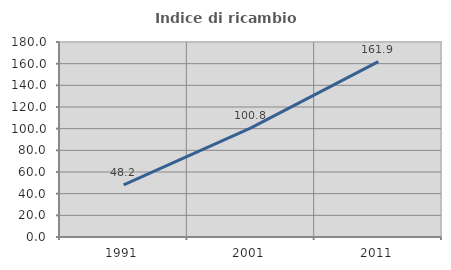
| Category | Indice di ricambio occupazionale  |
|---|---|
| 1991.0 | 48.155 |
| 2001.0 | 100.779 |
| 2011.0 | 161.871 |